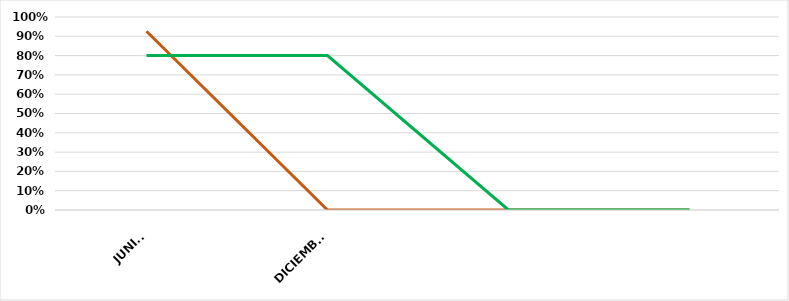
| Category | VALOR  | META PONDERADA |
|---|---|---|
| JUNIO | 0.926 | 0.8 |
| DICIEMBRE | 0 | 0.8 |